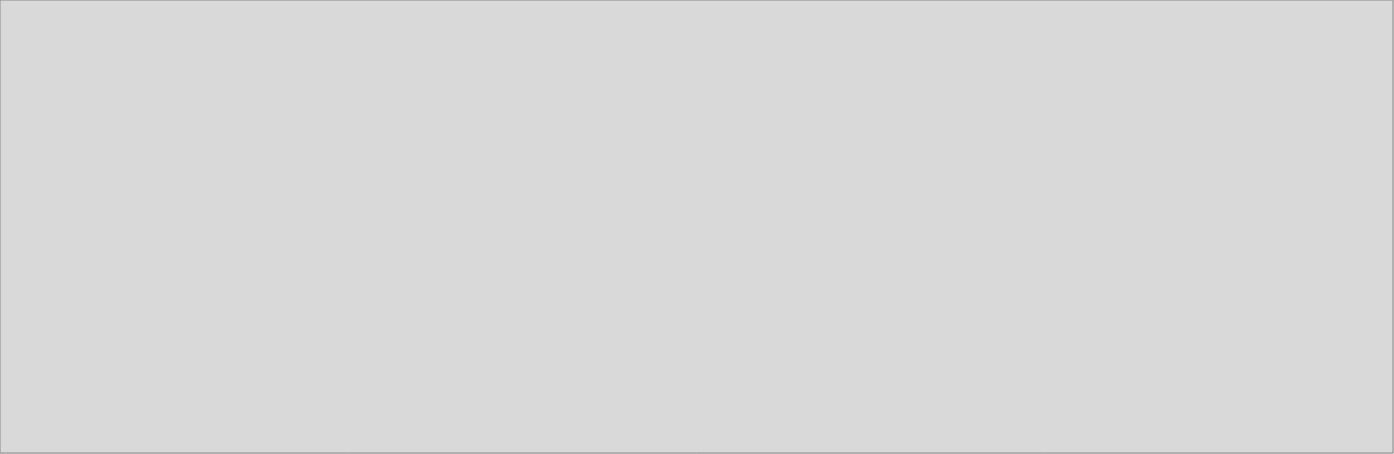
| Category | Impuestos netos de subvenciones a los productos |
|---|---|
| 2018_I | 6866.364 |
| 2018_II | 7857.236 |
| 2018_III | 7882.59 |
| 2018_IV | 9166.328 |
| 2019_I | 7466.106 |
| 2019_II | 8206.015 |
| 2019_III | 0 |
| 2019_IV | 0 |